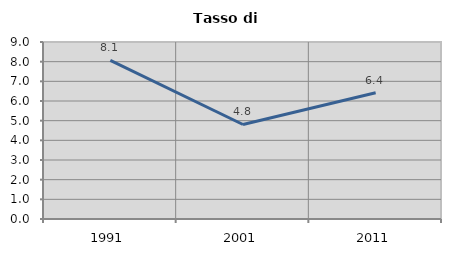
| Category | Tasso di disoccupazione   |
|---|---|
| 1991.0 | 8.065 |
| 2001.0 | 4.805 |
| 2011.0 | 6.422 |